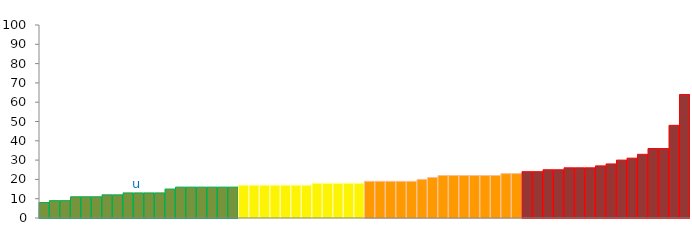
| Category | Top Quartile | 2nd Quartile | 3rd Quartile | Bottom Quartile | Series 4 |
|---|---|---|---|---|---|
|  | 8 | 0 | 0 | 0 | 8 |
|  | 9 | 0 | 0 | 0 | 9 |
|  | 9 | 0 | 0 | 0 | 9 |
|  | 11 | 0 | 0 | 0 | 11 |
|  | 11 | 0 | 0 | 0 | 11 |
|  | 11 | 0 | 0 | 0 | 11 |
|  | 12 | 0 | 0 | 0 | 12 |
|  | 12 | 0 | 0 | 0 | 12 |
|  | 13 | 0 | 0 | 0 | 13 |
| u | 13 | 0 | 0 | 0 | 13 |